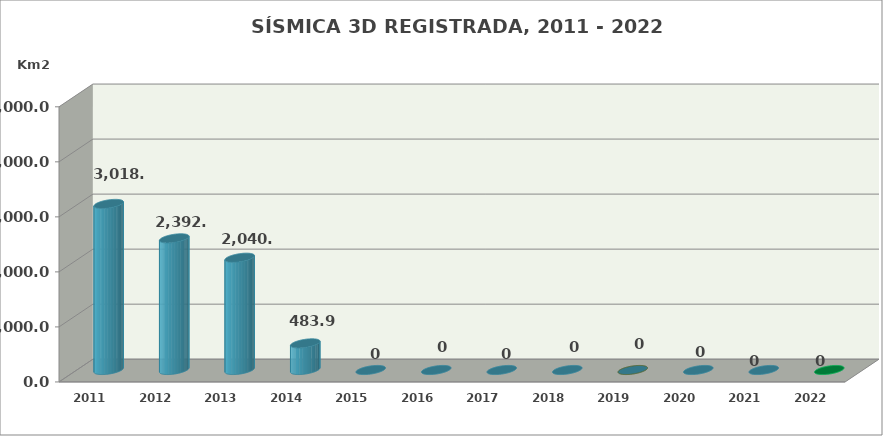
| Category | Series 0 |
|---|---|
| 2011.0 | 3018.02 |
| 2012.0 | 2392.47 |
| 2013.0 | 2040.1 |
| 2014.0 | 483.9 |
| 2015.0 | 0 |
| 2016.0 | 0 |
| 2017.0 | 0 |
| 2018.0 | 0 |
| 2019.0 | 0 |
| 2020.0 | 0 |
| 2021.0 | 0 |
| 2022.0 | 0 |